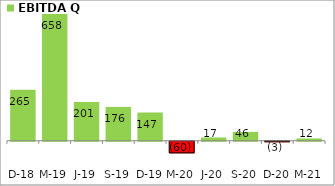
| Category | EBITDA Q |
|---|---|
| 2018-12-31 | 265.32 |
| 2019-03-31 | 658.06 |
| 2019-06-30 | 201.29 |
| 2019-09-30 | 175.83 |
| 2019-12-31 | 146.71 |
| 2020-03-31 | -60.26 |
| 2020-06-30 | 17.04 |
| 2020-09-30 | 46.12 |
| 2020-12-31 | -2.7 |
| 2021-03-31 | 11.94 |